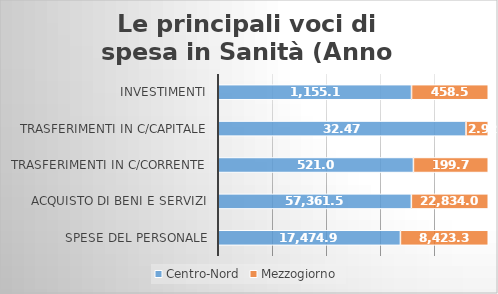
| Category | Centro-Nord | Mezzogiorno |
|---|---|---|
| Spese del personale | 17474.898 | 8423.315 |
| Acquisto di beni e servizi | 57361.569 | 22834.064 |
| Trasferimenti in c/corrente | 521.07 | 199.768 |
| Trasferimenti in c/capitale | 32.472 | 2.916 |
| Investimenti | 1155.171 | 458.588 |